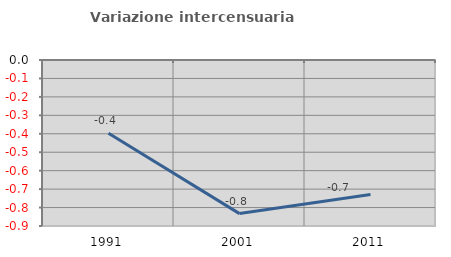
| Category | Variazione intercensuaria annua |
|---|---|
| 1991.0 | -0.397 |
| 2001.0 | -0.833 |
| 2011.0 | -0.729 |